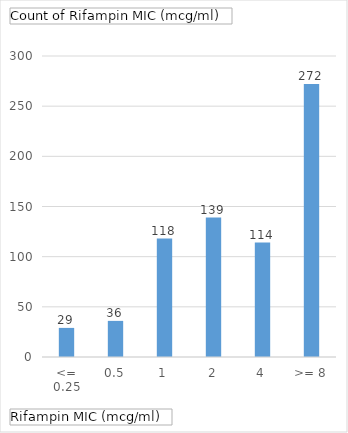
| Category | Total |
|---|---|
| <= 0.25 | 29 |
| 0.5 | 36 |
| 1 | 118 |
| 2 | 139 |
| 4 | 114 |
| >= 8 | 272 |